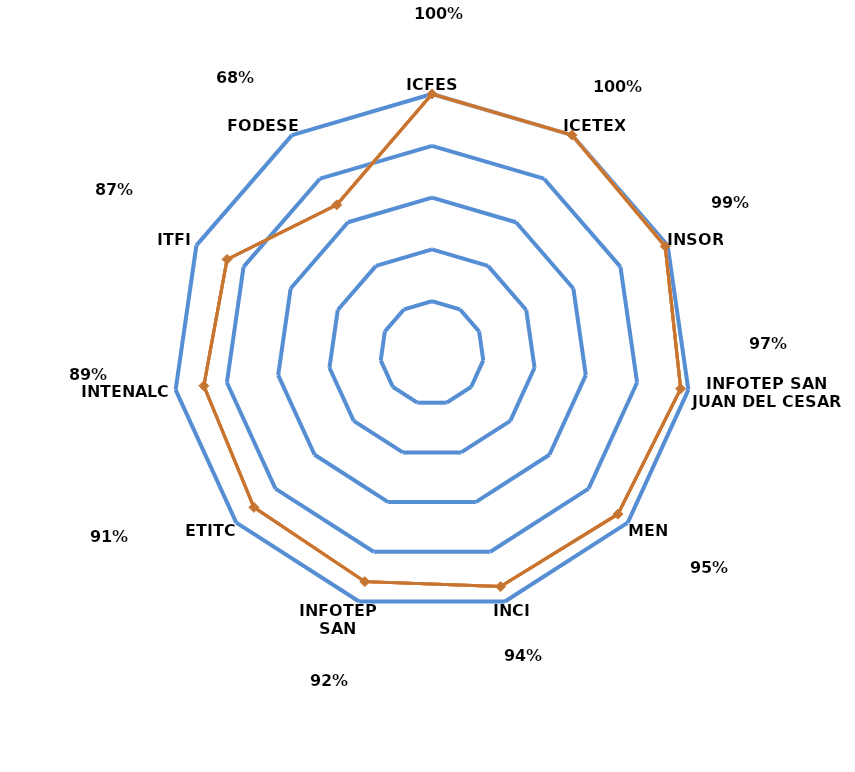
| Category | Series 4 | Series 5 | Series 6 | Series 7 | Series 2 | Series 3 | Series 1 | Series 0 |
|---|---|---|---|---|---|---|---|---|
| ICFES | 1 | 1 | 1 | 1 | 1 | 1 | 1 | 1 |
| ICETEX | 1 | 1 | 1 | 1 | 1 | 1 | 1 | 1 |
| INSOR | 0.99 | 0.99 | 0.99 | 0.99 | 0.99 | 0.99 | 0.99 | 0.99 |
| INFOTEP SAN JUAN DEL CESAR | 0.97 | 0.97 | 0.97 | 0.97 | 0.97 | 0.97 | 0.97 | 0.97 |
| MEN | 0.95 | 0.95 | 0.95 | 0.95 | 0.95 | 0.95 | 0.95 | 0.95 |
| INCI | 0.94 | 0.94 | 0.94 | 0.94 | 0.94 | 0.94 | 0.94 | 0.94 |
| INFOTEP SAN ANDRES | 0.92 | 0.92 | 0.92 | 0.92 | 0.92 | 0.92 | 0.92 | 0.92 |
| ETITC | 0.91 | 0.91 | 0.91 | 0.91 | 0.91 | 0.91 | 0.91 | 0.91 |
| INTENALCO | 0.89 | 0.89 | 0.89 | 0.89 | 0.89 | 0.89 | 0.89 | 0.89 |
| ITFIP | 0.87 | 0.87 | 0.87 | 0.87 | 0.87 | 0.87 | 0.87 | 0.87 |
| FODESEP | 0.68 | 0.68 | 0.68 | 0.68 | 0.68 | 0.68 | 0.68 | 0.68 |